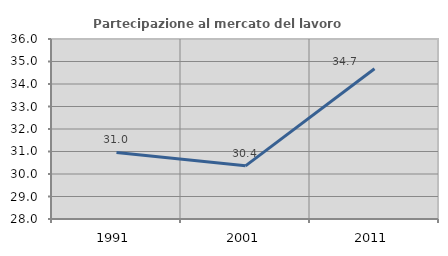
| Category | Partecipazione al mercato del lavoro  femminile |
|---|---|
| 1991.0 | 30.957 |
| 2001.0 | 30.362 |
| 2011.0 | 34.677 |